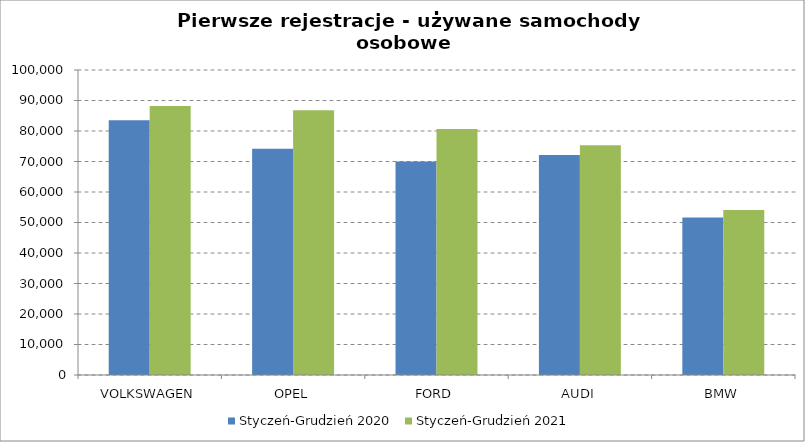
| Category | Styczeń-Grudzień 2020 | Styczeń-Grudzień 2021 |
|---|---|---|
| VOLKSWAGEN | 83504 | 88195 |
| OPEL | 74148 | 86839 |
| FORD | 70010 | 80652 |
| AUDI | 72169 | 75336 |
| BMW | 51654 | 54136 |